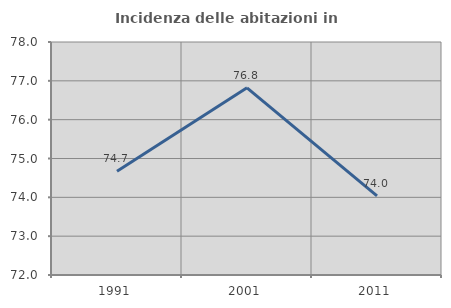
| Category | Incidenza delle abitazioni in proprietà  |
|---|---|
| 1991.0 | 74.673 |
| 2001.0 | 76.82 |
| 2011.0 | 74.037 |